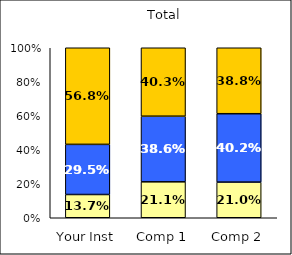
| Category | Low Social Agency | Average Social Agency | High Social Agency |
|---|---|---|---|
| Your Inst | 0.137 | 0.295 | 0.568 |
| Comp 1 | 0.211 | 0.386 | 0.403 |
| Comp 2 | 0.21 | 0.402 | 0.388 |